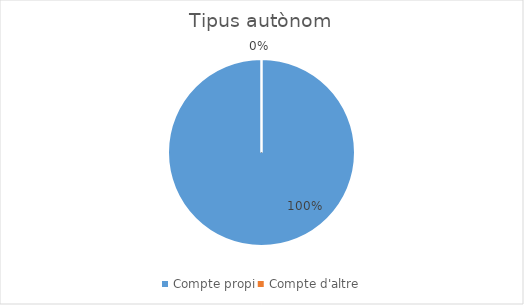
| Category | Series 0 |
|---|---|
| Compte propi | 5 |
| Compte d'altre | 0 |